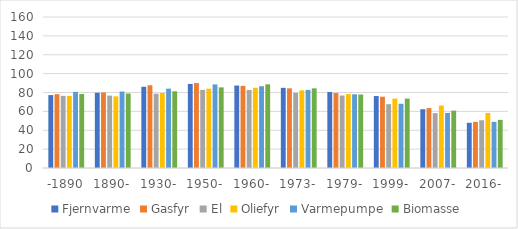
| Category | Fjernvarme | Gasfyr | El | Oliefyr | Varmepumpe | Biomasse |
|---|---|---|---|---|---|---|
| -1890 | 77.269 | 78.214 | 76.456 | 76.288 | 80.67 | 78.418 |
| 1890- | 79.74 | 80.032 | 76.675 | 75.9 | 81.051 | 78.929 |
| 1930- | 86.061 | 87.694 | 78.713 | 79.511 | 84.063 | 81.279 |
| 1950- | 89.063 | 89.971 | 82.734 | 84.026 | 88.575 | 85.457 |
| 1960- | 87.366 | 87.037 | 82.629 | 85.025 | 86.659 | 88.661 |
| 1973- | 84.946 | 84.406 | 79.63 | 82.335 | 82.761 | 84.416 |
| 1979- | 80.474 | 79.45 | 76.798 | 78.316 | 78.11 | 77.846 |
| 1999- | 76.237 | 75.517 | 67.634 | 73.54 | 68.059 | 73.544 |
| 2007- | 62.264 | 63.462 | 58.116 | 66.192 | 58.328 | 60.784 |
| 2016- | 47.907 | 48.911 | 50.562 | 58.338 | 48.87 | 50.998 |